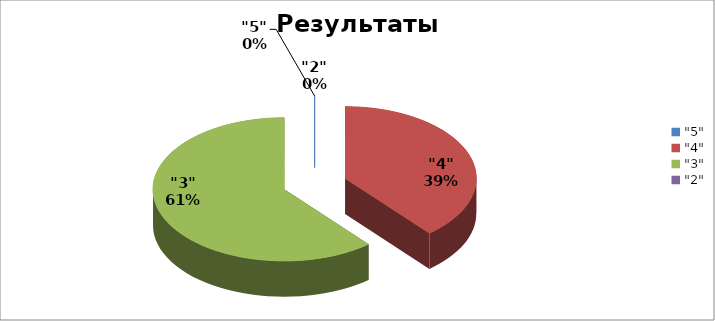
| Category | Series 0 |
|---|---|
| "5" | 0 |
| "4" | 0.389 |
| "3" | 0.611 |
| "2" | 0 |